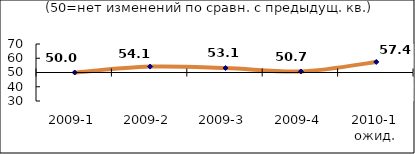
| Category | Диф.индекс ↓ |
|---|---|
| 2009-1 | 49.995 |
| 2009-2 | 54.14 |
| 2009-3 | 53.125 |
| 2009-4 | 50.73 |
| 2010-1 ожид. | 57.405 |